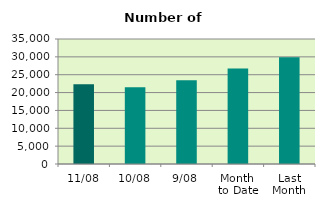
| Category | Series 0 |
|---|---|
| 11/08 | 22354 |
| 10/08 | 21508 |
| 9/08 | 23474 |
| Month 
to Date | 26722.667 |
| Last
Month | 29864.476 |